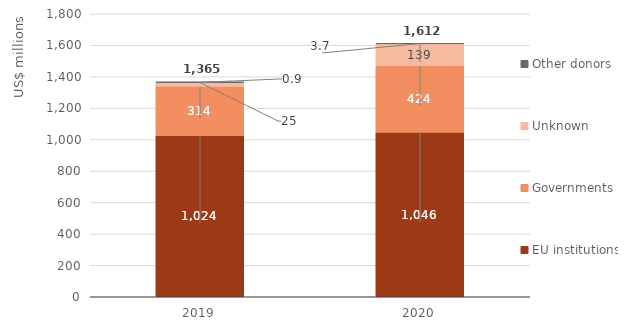
| Category | EU institutions | Governments | Unknown | Other donors |
|---|---|---|---|---|
| 2019.0 | 1024.469 | 314.155 | 25.467 | 0.855 |
| 2020.0 | 1046.056 | 423.745 | 138.829 | 3.694 |